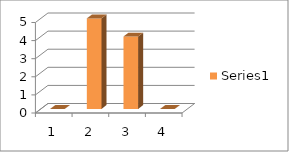
| Category | Series 0 |
|---|---|
| 0 | 0 |
| 1 | 5 |
| 2 | 4 |
| 3 | 0 |